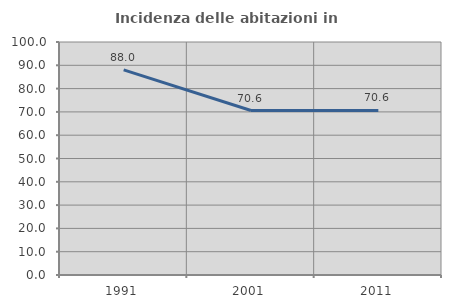
| Category | Incidenza delle abitazioni in proprietà  |
|---|---|
| 1991.0 | 88.039 |
| 2001.0 | 70.578 |
| 2011.0 | 70.648 |